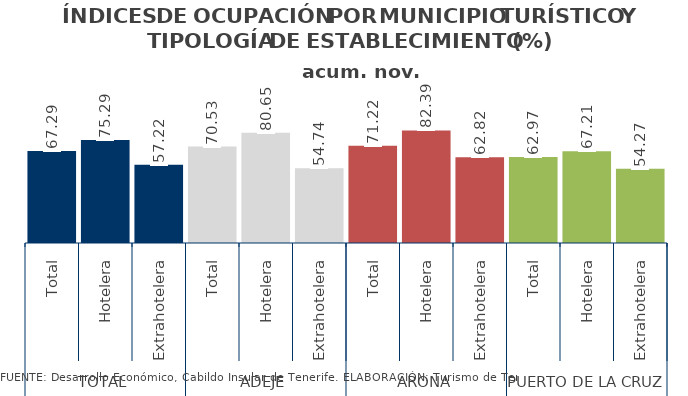
| Category | acum. nov. 2014 |
|---|---|
| 0 | 67.288 |
| 1 | 75.287 |
| 2 | 57.22 |
| 3 | 70.531 |
| 4 | 80.646 |
| 5 | 54.743 |
| 6 | 71.215 |
| 7 | 82.391 |
| 8 | 62.818 |
| 9 | 62.97 |
| 10 | 67.209 |
| 11 | 54.269 |